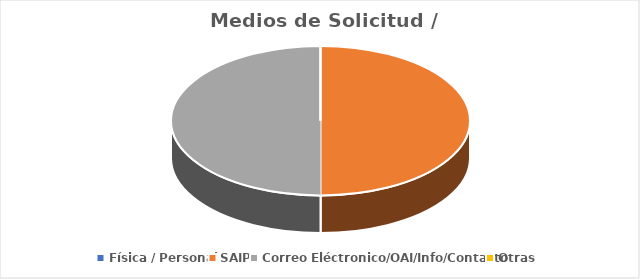
| Category | Series 0 |
|---|---|
| Física / Personal | 0 |
| SAIP | 3 |
| Correo Eléctronico/OAI/Info/Contacto | 3 |
| Otras | 0 |